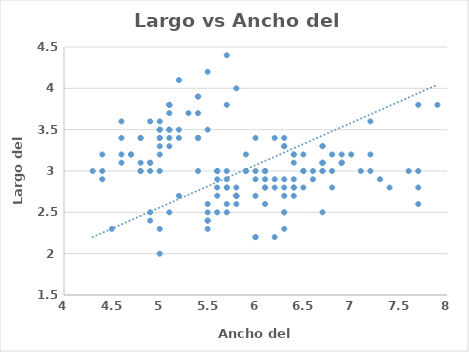
| Category | Series 0 |
|---|---|
| 5.1 | 3.5 |
| 4.9 | 3 |
| 4.7 | 3.2 |
| 4.6 | 3.1 |
| 5.0 | 3.6 |
| 5.4 | 3.9 |
| 4.6 | 3.4 |
| 5.0 | 3.4 |
| 4.4 | 2.9 |
| 4.9 | 3.1 |
| 5.4 | 3.7 |
| 4.8 | 3.4 |
| 4.8 | 3 |
| 4.3 | 3 |
| 5.8 | 4 |
| 5.7 | 4.4 |
| 5.4 | 3.9 |
| 5.1 | 3.5 |
| 5.7 | 3.8 |
| 5.1 | 3.8 |
| 5.4 | 3.4 |
| 5.1 | 3.7 |
| 4.6 | 3.6 |
| 5.1 | 3.3 |
| 4.8 | 3.4 |
| 5.0 | 3 |
| 5.0 | 3.4 |
| 5.2 | 3.5 |
| 5.2 | 3.4 |
| 4.7 | 3.2 |
| 4.8 | 3.1 |
| 5.4 | 3.4 |
| 5.2 | 4.1 |
| 5.5 | 4.2 |
| 4.9 | 3.1 |
| 5.0 | 3.2 |
| 5.5 | 3.5 |
| 4.9 | 3.6 |
| 4.4 | 3 |
| 5.1 | 3.4 |
| 5.0 | 3.5 |
| 4.5 | 2.3 |
| 4.4 | 3.2 |
| 5.0 | 3.5 |
| 5.1 | 3.8 |
| 4.8 | 3 |
| 5.1 | 3.8 |
| 4.6 | 3.2 |
| 5.3 | 3.7 |
| 5.0 | 3.3 |
| 7.0 | 3.2 |
| 6.4 | 3.2 |
| 6.9 | 3.1 |
| 5.5 | 2.3 |
| 6.5 | 2.8 |
| 5.7 | 2.8 |
| 6.3 | 3.3 |
| 4.9 | 2.4 |
| 6.6 | 2.9 |
| 5.2 | 2.7 |
| 5.0 | 2 |
| 5.9 | 3 |
| 6.0 | 2.2 |
| 6.1 | 2.9 |
| 5.6 | 2.9 |
| 6.7 | 3.1 |
| 5.6 | 3 |
| 5.8 | 2.7 |
| 6.2 | 2.2 |
| 5.6 | 2.5 |
| 5.9 | 3.2 |
| 6.1 | 2.8 |
| 6.3 | 2.5 |
| 6.1 | 2.8 |
| 6.4 | 2.9 |
| 6.6 | 3 |
| 6.8 | 2.8 |
| 6.7 | 3 |
| 6.0 | 2.9 |
| 5.7 | 2.6 |
| 5.5 | 2.4 |
| 5.5 | 2.4 |
| 5.8 | 2.7 |
| 6.0 | 2.7 |
| 5.4 | 3 |
| 6.0 | 3.4 |
| 6.7 | 3.1 |
| 6.3 | 2.3 |
| 5.6 | 3 |
| 5.5 | 2.5 |
| 5.5 | 2.6 |
| 6.1 | 3 |
| 5.8 | 2.6 |
| 5.0 | 2.3 |
| 5.6 | 2.7 |
| 5.7 | 3 |
| 5.7 | 2.9 |
| 6.2 | 2.9 |
| 5.1 | 2.5 |
| 5.7 | 2.8 |
| 6.3 | 3.3 |
| 5.8 | 2.7 |
| 7.1 | 3 |
| 6.3 | 2.9 |
| 6.5 | 3 |
| 7.6 | 3 |
| 4.9 | 2.5 |
| 7.3 | 2.9 |
| 6.7 | 2.5 |
| 7.2 | 3.6 |
| 6.5 | 3.2 |
| 6.4 | 2.7 |
| 6.8 | 3 |
| 5.7 | 2.5 |
| 5.8 | 2.8 |
| 6.4 | 3.2 |
| 6.5 | 3 |
| 7.7 | 3.8 |
| 7.7 | 2.6 |
| 6.0 | 2.2 |
| 6.9 | 3.2 |
| 5.6 | 2.8 |
| 7.7 | 2.8 |
| 6.3 | 2.7 |
| 6.7 | 3.3 |
| 7.2 | 3.2 |
| 6.2 | 2.8 |
| 6.1 | 3 |
| 6.4 | 2.8 |
| 7.2 | 3 |
| 7.4 | 2.8 |
| 7.9 | 3.8 |
| 6.4 | 2.8 |
| 6.3 | 2.8 |
| 6.1 | 2.6 |
| 7.7 | 3 |
| 6.3 | 3.4 |
| 6.4 | 3.1 |
| 6.0 | 3 |
| 6.9 | 3.1 |
| 6.7 | 3.1 |
| 6.9 | 3.1 |
| 5.8 | 2.7 |
| 6.8 | 3.2 |
| 6.7 | 3.3 |
| 6.7 | 3 |
| 6.3 | 2.5 |
| 6.5 | 3 |
| 6.2 | 3.4 |
| 5.9 | 3 |